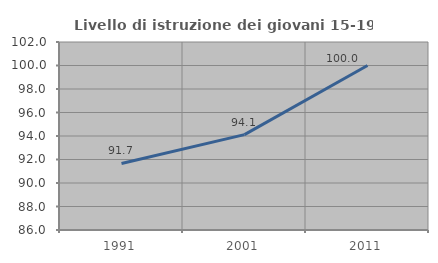
| Category | Livello di istruzione dei giovani 15-19 anni |
|---|---|
| 1991.0 | 91.667 |
| 2001.0 | 94.118 |
| 2011.0 | 100 |